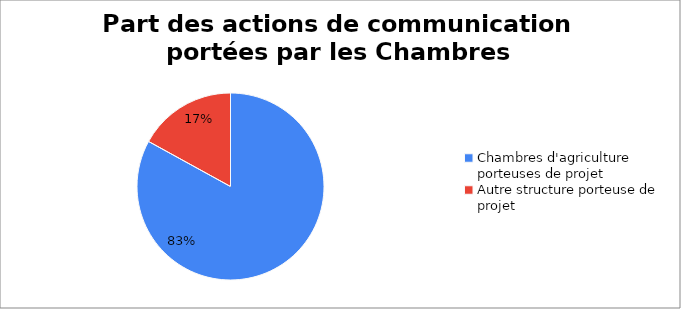
| Category | Part des actions de communication portées par les Chambres d'agriculture |
|---|---|
| Chambres d'agriculture porteuses de projet | 0.83 |
| Autre structure porteuse de projet | 0.17 |